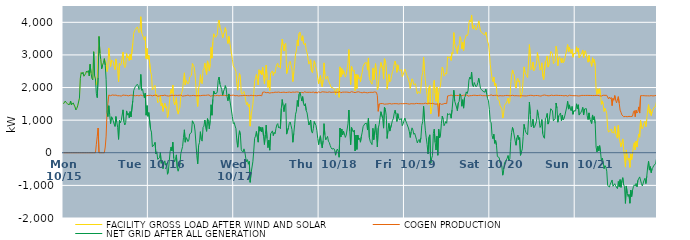
| Category | FACILITY GROSS LOAD AFTER WIND AND SOLAR | COGEN PRODUCTION | NET GRID AFTER ALL GENERATION |
|---|---|---|---|
|  Mon  10/15 | 1501 | 0 | 1501 |
|  Mon  10/15 | 1526 | 0 | 1526 |
|  Mon  10/15 | 1584 | 0 | 1584 |
|  Mon  10/15 | 1548 | 0 | 1548 |
|  Mon  10/15 | 1516 | 0 | 1516 |
|  Mon  10/15 | 1484 | 0 | 1484 |
|  Mon  10/15 | 1492 | 0 | 1492 |
|  Mon  10/15 | 1483 | 0 | 1483 |
|  Mon  10/15 | 1587 | 0 | 1587 |
|  Mon  10/15 | 1468 | 0 | 1468 |
|  Mon  10/15 | 1452 | 0 | 1452 |
|  Mon  10/15 | 1530 | 0 | 1530 |
|  Mon  10/15 | 1464 | 0 | 1464 |
|  Mon  10/15 | 1406 | 0 | 1406 |
|  Mon  10/15 | 1312 | 0 | 1312 |
|  Mon  10/15 | 1363 | 0 | 1363 |
|  Mon  10/15 | 1439 | 0 | 1439 |
|  Mon  10/15 | 1452 | 0 | 1452 |
|  Mon  10/15 | 1676 | 0 | 1676 |
|  Mon  10/15 | 2285 | 0 | 2285 |
|  Mon  10/15 | 2459 | 0 | 2459 |
|  Mon  10/15 | 2412 | 0 | 2412 |
|  Mon  10/15 | 2471 | 0 | 2471 |
|  Mon  10/15 | 2347 | 0 | 2347 |
|  Mon  10/15 | 2388 | 0 | 2388 |
|  Mon  10/15 | 2430 | 0 | 2430 |
|  Mon  10/15 | 2507 | 0 | 2507 |
|  Mon  10/15 | 2468 | 0 | 2468 |
|  Mon  10/15 | 2520 | 0 | 2520 |
|  Mon  10/15 | 2356 | 0 | 2356 |
|  Mon  10/15 | 2713 | 0 | 2713 |
|  Mon  10/15 | 2451 | 0 | 2451 |
|  Mon  10/15 | 2283 | 0 | 2283 |
|  Mon  10/15 | 2235 | 0 | 2235 |
|  Mon  10/15 | 3098 | 0 | 3098 |
|  Mon  10/15 | 2362 | 0 | 2362 |
|  Mon  10/15 | 2264 | 0 | 2264 |
|  Mon  10/15 | 2079 | 261 | 1818 |
|  Mon  10/15 | 2192 | 502 | 1690 |
|  Mon  10/15 | 3062 | 759 | 2303 |
|  Mon  10/15 | 3566 | 0 | 3566 |
|  Mon  10/15 | 3056 | 0 | 3056 |
|  Mon  10/15 | 2862 | 0 | 2862 |
|  Mon  10/15 | 2576 | 0 | 2576 |
|  Mon  10/15 | 2689 | 0 | 2689 |
|  Mon  10/15 | 2764 | 0 | 2764 |
|  Mon  10/15 | 2886 | 0 | 2886 |
|  Mon  10/15 | 2862 | 175 | 2687 |
|  Mon  10/15 | 2758 | 510 | 2248 |
|  Mon  10/15 | 2489 | 1249 | 1240 |
|  Mon  10/15 | 2614 | 1505 | 1109 |
|  Mon  10/15 | 3213 | 1771 | 1442 |
|  Mon  10/15 | 2925 | 1753 | 1172 |
|  Mon  10/15 | 2644 | 1750 | 894 |
|  Mon  10/15 | 2839 | 1736 | 1103 |
|  Mon  10/15 | 2842 | 1773 | 1069 |
|  Mon  10/15 | 2797 | 1750 | 1047 |
|  Mon  10/15 | 2642 | 1763 | 879 |
|  Mon  10/15 | 2551 | 1743 | 808 |
|  Mon  10/15 | 2878 | 1768 | 1110 |
|  Mon  10/15 | 2702 | 1770 | 932 |
|  Mon  10/15 | 2529 | 1748 | 781 |
|  Mon  10/15 | 2179 | 1768 | 411 |
|  Mon  10/15 | 2741 | 1749 | 992 |
|  Mon  10/15 | 2684 | 1764 | 920 |
|  Mon  10/15 | 2727 | 1738 | 989 |
|  Mon  10/15 | 2743 | 1748 | 995 |
|  Mon  10/15 | 3087 | 1771 | 1316 |
|  Mon  10/15 | 2707 | 1753 | 954 |
|  Mon  10/15 | 2612 | 1761 | 851 |
|  Mon  10/15 | 2681 | 1754 | 927 |
|  Mon  10/15 | 3043 | 1760 | 1283 |
|  Mon  10/15 | 2908 | 1753 | 1155 |
|  Mon  10/15 | 2953 | 1745 | 1208 |
|  Mon  10/15 | 2826 | 1752 | 1074 |
|  Mon  10/15 | 3024 | 1762 | 1262 |
|  Mon  10/15 | 2848 | 1748 | 1100 |
|  Mon  10/15 | 2847 | 1766 | 1081 |
|  Mon  10/15 | 3351 | 1752 | 1599 |
|  Mon  10/15 | 3660 | 1754 | 1906 |
|  Mon  10/15 | 3741 | 1760 | 1981 |
|  Mon  10/15 | 3781 | 1749 | 2032 |
|  Mon  10/15 | 3796 | 1762 | 2034 |
|  Mon  10/15 | 3859 | 1758 | 2101 |
|  Mon  10/15 | 3830 | 1771 | 2059 |
|  Mon  10/15 | 3684 | 1745 | 1939 |
|  Mon  10/15 | 3724 | 1754 | 1970 |
|  Mon  10/15 | 4171 | 1769 | 2402 |
|  Mon  10/15 | 3672 | 1757 | 1915 |
|  Mon  10/15 | 3702 | 1749 | 1953 |
|  Mon  10/15 | 3532 | 1739 | 1793 |
|  Mon  10/15 | 3455 | 1767 | 1688 |
|  Mon  10/15 | 3561 | 1735 | 1826 |
|  Mon  10/15 | 2886 | 1734 | 1152 |
|  Mon  10/15 | 3199 | 1753 | 1446 |
|  Mon  10/15 | 2870 | 1752 | 1118 |
|  Tue  10/16 | 2990 | 1759 | 1231 |
|  Tue  10/16 | 2997 | 1758 | 1239 |
|  Tue  10/16 | 2483 | 1762 | 721 |
|  Tue  10/16 | 2394 | 1761 | 633 |
|  Tue  10/16 | 1928 | 1745 | 183 |
|  Tue  10/16 | 1958 | 1764 | 194 |
|  Tue  10/16 | 2013 | 1762 | 251 |
|  Tue  10/16 | 2069 | 1750 | 319 |
|  Tue  10/16 | 1732 | 1766 | -34 |
|  Tue  10/16 | 1791 | 1763 | 28 |
|  Tue  10/16 | 1533 | 1734 | -201 |
|  Tue  10/16 | 1525 | 1755 | -230 |
|  Tue  10/16 | 1589 | 1742 | -153 |
|  Tue  10/16 | 1760 | 1754 | 6 |
|  Tue  10/16 | 1434 | 1755 | -321 |
|  Tue  10/16 | 1520 | 1764 | -244 |
|  Tue  10/16 | 1270 | 1753 | -483 |
|  Tue  10/16 | 1440 | 1763 | -323 |
|  Tue  10/16 | 1521 | 1768 | -247 |
|  Tue  10/16 | 1370 | 1753 | -383 |
|  Tue  10/16 | 1420 | 1749 | -329 |
|  Tue  10/16 | 1082 | 1740 | -658 |
|  Tue  10/16 | 1170 | 1739 | -569 |
|  Tue  10/16 | 1487 | 1744 | -257 |
|  Tue  10/16 | 1787 | 1748 | 39 |
|  Tue  10/16 | 1937 | 1763 | 174 |
|  Tue  10/16 | 1823 | 1764 | 59 |
|  Tue  10/16 | 2074 | 1751 | 323 |
|  Tue  10/16 | 1592 | 1756 | -164 |
|  Tue  10/16 | 1465 | 1744 | -279 |
|  Tue  10/16 | 1560 | 1762 | -202 |
|  Tue  10/16 | 1692 | 1757 | -65 |
|  Tue  10/16 | 1285 | 1758 | -473 |
|  Tue  10/16 | 1185 | 1751 | -566 |
|  Tue  10/16 | 1298 | 1762 | -464 |
|  Tue  10/16 | 1390 | 1765 | -375 |
|  Tue  10/16 | 1746 | 1769 | -23 |
|  Tue  10/16 | 1724 | 1758 | -34 |
|  Tue  10/16 | 1930 | 1736 | 194 |
|  Tue  10/16 | 2234 | 1763 | 471 |
|  Tue  10/16 | 2451 | 1747 | 704 |
|  Tue  10/16 | 2085 | 1761 | 324 |
|  Tue  10/16 | 2215 | 1752 | 463 |
|  Tue  10/16 | 2172 | 1748 | 424 |
|  Tue  10/16 | 2111 | 1768 | 343 |
|  Tue  10/16 | 2155 | 1767 | 388 |
|  Tue  10/16 | 2323 | 1745 | 578 |
|  Tue  10/16 | 2333 | 1758 | 575 |
|  Tue  10/16 | 2374 | 1752 | 622 |
|  Tue  10/16 | 2735 | 1756 | 979 |
|  Tue  10/16 | 2677 | 1760 | 917 |
|  Tue  10/16 | 2628 | 1751 | 877 |
|  Tue  10/16 | 2416 | 1750 | 666 |
|  Tue  10/16 | 2391 | 1755 | 636 |
|  Tue  10/16 | 1658 | 1749 | -91 |
|  Tue  10/16 | 1421 | 1761 | -340 |
|  Tue  10/16 | 1974 | 1750 | 224 |
|  Tue  10/16 | 2083 | 1764 | 319 |
|  Tue  10/16 | 2394 | 1749 | 645 |
|  Tue  10/16 | 2151 | 1749 | 402 |
|  Tue  10/16 | 2116 | 1759 | 357 |
|  Tue  10/16 | 2525 | 1748 | 777 |
|  Tue  10/16 | 2579 | 1762 | 817 |
|  Tue  10/16 | 2747 | 1745 | 1002 |
|  Tue  10/16 | 2776 | 1760 | 1016 |
|  Tue  10/16 | 2401 | 1742 | 659 |
|  Tue  10/16 | 2817 | 1769 | 1048 |
|  Tue  10/16 | 2710 | 1755 | 955 |
|  Tue  10/16 | 2506 | 1772 | 734 |
|  Tue  10/16 | 2724 | 1733 | 991 |
|  Tue  10/16 | 3231 | 1758 | 1473 |
|  Tue  10/16 | 2900 | 1749 | 1151 |
|  Tue  10/16 | 3393 | 1755 | 1638 |
|  Tue  10/16 | 3647 | 1753 | 1894 |
|  Tue  10/16 | 3575 | 1764 | 1811 |
|  Tue  10/16 | 3537 | 1750 | 1787 |
|  Tue  10/16 | 3562 | 1742 | 1820 |
|  Tue  10/16 | 3627 | 1759 | 1868 |
|  Tue  10/16 | 3974 | 1755 | 2219 |
|  Tue  10/16 | 4067 | 1746 | 2321 |
|  Tue  10/16 | 3847 | 1743 | 2104 |
|  Tue  10/16 | 3840 | 1764 | 2076 |
|  Tue  10/16 | 3697 | 1760 | 1937 |
|  Tue  10/16 | 3519 | 1754 | 1765 |
|  Tue  10/16 | 3638 | 1751 | 1887 |
|  Tue  10/16 | 3703 | 1761 | 1942 |
|  Tue  10/16 | 3837 | 1779 | 2058 |
|  Tue  10/16 | 3719 | 1753 | 1966 |
|  Tue  10/16 | 3478 | 1763 | 1715 |
|  Tue  10/16 | 3349 | 1754 | 1595 |
|  Tue  10/16 | 3567 | 1763 | 1804 |
|  Tue  10/16 | 3385 | 1755 | 1630 |
|  Tue  10/16 | 3218 | 1755 | 1463 |
|  Tue  10/16 | 3214 | 1760 | 1454 |
|  Tue  10/16 | 2859 | 1754 | 1105 |
|  Tue  10/16 | 2662 | 1768 | 894 |
|  Wed  10/17 | 2680 | 1755 | 925 |
|  Wed  10/17 | 2567 | 1747 | 820 |
|  Wed  10/17 | 2488 | 1750 | 738 |
|  Wed  10/17 | 2117 | 1755 | 362 |
|  Wed  10/17 | 1920 | 1750 | 170 |
|  Wed  10/17 | 2245 | 1741 | 504 |
|  Wed  10/17 | 2433 | 1758 | 675 |
|  Wed  10/17 | 2295 | 1751 | 544 |
|  Wed  10/17 | 1841 | 1748 | 93 |
|  Wed  10/17 | 1797 | 1751 | 46 |
|  Wed  10/17 | 1788 | 1773 | 15 |
|  Wed  10/17 | 1881 | 1761 | 120 |
|  Wed  10/17 | 1776 | 1752 | 24 |
|  Wed  10/17 | 1594 | 1756 | -162 |
|  Wed  10/17 | 1475 | 1752 | -277 |
|  Wed  10/17 | 1541 | 1752 | -211 |
|  Wed  10/17 | 1411 | 1761 | -350 |
|  Wed  10/17 | 1485 | 1749 | -264 |
|  Wed  10/17 | 816 | 1722 | -906 |
|  Wed  10/17 | 1141 | 1764 | -623 |
|  Wed  10/17 | 1131 | 1757 | -626 |
|  Wed  10/17 | 1475 | 1752 | -277 |
|  Wed  10/17 | 1813 | 1759 | 54 |
|  Wed  10/17 | 2199 | 1754 | 445 |
|  Wed  10/17 | 2275 | 1766 | 509 |
|  Wed  10/17 | 2401 | 1748 | 653 |
|  Wed  10/17 | 2256 | 1769 | 487 |
|  Wed  10/17 | 2078 | 1754 | 324 |
|  Wed  10/17 | 2545 | 1744 | 801 |
|  Wed  10/17 | 2424 | 1761 | 663 |
|  Wed  10/17 | 2516 | 1734 | 782 |
|  Wed  10/17 | 2388 | 1747 | 641 |
|  Wed  10/17 | 2627 | 1855 | 772 |
|  Wed  10/17 | 2360 | 1851 | 509 |
|  Wed  10/17 | 2117 | 1863 | 254 |
|  Wed  10/17 | 2420 | 1867 | 553 |
|  Wed  10/17 | 2691 | 1843 | 848 |
|  Wed  10/17 | 2295 | 1860 | 435 |
|  Wed  10/17 | 2003 | 1847 | 156 |
|  Wed  10/17 | 2223 | 1836 | 387 |
|  Wed  10/17 | 1911 | 1831 | 80 |
|  Wed  10/17 | 2438 | 1857 | 581 |
|  Wed  10/17 | 2444 | 1843 | 601 |
|  Wed  10/17 | 2511 | 1840 | 671 |
|  Wed  10/17 | 2370 | 1843 | 527 |
|  Wed  10/17 | 2475 | 1852 | 623 |
|  Wed  10/17 | 2441 | 1858 | 583 |
|  Wed  10/17 | 2614 | 1866 | 748 |
|  Wed  10/17 | 2709 | 1853 | 856 |
|  Wed  10/17 | 2741 | 1847 | 894 |
|  Wed  10/17 | 2626 | 1861 | 765 |
|  Wed  10/17 | 2663 | 1867 | 796 |
|  Wed  10/17 | 2589 | 1848 | 741 |
|  Wed  10/17 | 3205 | 1845 | 1360 |
|  Wed  10/17 | 3484 | 1852 | 1632 |
|  Wed  10/17 | 3306 | 1861 | 1445 |
|  Wed  10/17 | 3119 | 1858 | 1261 |
|  Wed  10/17 | 3325 | 1864 | 1461 |
|  Wed  10/17 | 3357 | 1847 | 1510 |
|  Wed  10/17 | 2425 | 1853 | 572 |
|  Wed  10/17 | 2431 | 1853 | 578 |
|  Wed  10/17 | 2623 | 1852 | 771 |
|  Wed  10/17 | 2763 | 1861 | 902 |
|  Wed  10/17 | 2805 | 1861 | 944 |
|  Wed  10/17 | 2676 | 1848 | 828 |
|  Wed  10/17 | 2566 | 1859 | 707 |
|  Wed  10/17 | 2184 | 1861 | 323 |
|  Wed  10/17 | 2467 | 1873 | 594 |
|  Wed  10/17 | 2711 | 1855 | 856 |
|  Wed  10/17 | 3034 | 1852 | 1182 |
|  Wed  10/17 | 3141 | 1865 | 1276 |
|  Wed  10/17 | 3460 | 1857 | 1603 |
|  Wed  10/17 | 3282 | 1861 | 1421 |
|  Wed  10/17 | 3655 | 1858 | 1797 |
|  Wed  10/17 | 3700 | 1840 | 1860 |
|  Wed  10/17 | 3585 | 1850 | 1735 |
|  Wed  10/17 | 3438 | 1852 | 1586 |
|  Wed  10/17 | 3586 | 1865 | 1721 |
|  Wed  10/17 | 3343 | 1837 | 1506 |
|  Wed  10/17 | 3308 | 1873 | 1435 |
|  Wed  10/17 | 3367 | 1862 | 1505 |
|  Wed  10/17 | 3150 | 1853 | 1297 |
|  Wed  10/17 | 3068 | 1846 | 1222 |
|  Wed  10/17 | 3072 | 1854 | 1218 |
|  Wed  10/17 | 2717 | 1866 | 851 |
|  Wed  10/17 | 2777 | 1855 | 922 |
|  Wed  10/17 | 2853 | 1854 | 999 |
|  Wed  10/17 | 2507 | 1850 | 657 |
|  Wed  10/17 | 2454 | 1851 | 603 |
|  Wed  10/17 | 2600 | 1862 | 738 |
|  Wed  10/17 | 2819 | 1860 | 959 |
|  Wed  10/17 | 2715 | 1833 | 882 |
|  Wed  10/17 | 2708 | 1869 | 839 |
|  Wed  10/17 | 2504 | 1827 | 677 |
|  Wed  10/17 | 2287 | 1848 | 439 |
|  Wed  10/17 | 2117 | 1867 | 250 |
|  Thu  10/18 | 2286 | 1850 | 436 |
|  Thu  10/18 | 2367 | 1846 | 521 |
|  Thu  10/18 | 2117 | 1850 | 267 |
|  Thu  10/18 | 2019 | 1870 | 149 |
|  Thu  10/18 | 2233 | 1863 | 370 |
|  Thu  10/18 | 2756 | 1864 | 892 |
|  Thu  10/18 | 2407 | 1855 | 552 |
|  Thu  10/18 | 2252 | 1859 | 393 |
|  Thu  10/18 | 2312 | 1865 | 447 |
|  Thu  10/18 | 2354 | 1852 | 502 |
|  Thu  10/18 | 2207 | 1853 | 354 |
|  Thu  10/18 | 2179 | 1867 | 312 |
|  Thu  10/18 | 2084 | 1862 | 222 |
|  Thu  10/18 | 2006 | 1851 | 155 |
|  Thu  10/18 | 1985 | 1871 | 114 |
|  Thu  10/18 | 1992 | 1857 | 135 |
|  Thu  10/18 | 1997 | 1867 | 130 |
|  Thu  10/18 | 1943 | 1858 | 85 |
|  Thu  10/18 | 1773 | 1847 | -74 |
|  Thu  10/18 | 1912 | 1854 | 58 |
|  Thu  10/18 | 1976 | 1863 | 113 |
|  Thu  10/18 | 1908 | 1856 | 52 |
|  Thu  10/18 | 1698 | 1835 | -137 |
|  Thu  10/18 | 2634 | 1875 | 759 |
|  Thu  10/18 | 2323 | 1840 | 483 |
|  Thu  10/18 | 2584 | 1857 | 727 |
|  Thu  10/18 | 2406 | 1859 | 547 |
|  Thu  10/18 | 2517 | 1855 | 662 |
|  Thu  10/18 | 2433 | 1859 | 574 |
|  Thu  10/18 | 2320 | 1849 | 471 |
|  Thu  10/18 | 2398 | 1860 | 538 |
|  Thu  10/18 | 2388 | 1855 | 533 |
|  Thu  10/18 | 2743 | 1856 | 887 |
|  Thu  10/18 | 3164 | 1853 | 1311 |
|  Thu  10/18 | 2501 | 1846 | 655 |
|  Thu  10/18 | 2091 | 1847 | 244 |
|  Thu  10/18 | 2649 | 1873 | 776 |
|  Thu  10/18 | 2547 | 1860 | 687 |
|  Thu  10/18 | 2494 | 1857 | 637 |
|  Thu  10/18 | 2535 | 1841 | 694 |
|  Thu  10/18 | 1902 | 1845 | 57 |
|  Thu  10/18 | 2411 | 1867 | 544 |
|  Thu  10/18 | 1966 | 1863 | 103 |
|  Thu  10/18 | 2391 | 1847 | 544 |
|  Thu  10/18 | 2274 | 1869 | 405 |
|  Thu  10/18 | 2306 | 1865 | 441 |
|  Thu  10/18 | 2174 | 1850 | 324 |
|  Thu  10/18 | 2356 | 1855 | 501 |
|  Thu  10/18 | 2471 | 1839 | 632 |
|  Thu  10/18 | 2648 | 1845 | 803 |
|  Thu  10/18 | 2636 | 1859 | 777 |
|  Thu  10/18 | 2755 | 1861 | 894 |
|  Thu  10/18 | 2747 | 1845 | 902 |
|  Thu  10/18 | 2762 | 1856 | 906 |
|  Thu  10/18 | 2535 | 1838 | 697 |
|  Thu  10/18 | 2907 | 1841 | 1066 |
|  Thu  10/18 | 2313 | 1850 | 463 |
|  Thu  10/18 | 2202 | 1853 | 349 |
|  Thu  10/18 | 2189 | 1854 | 335 |
|  Thu  10/18 | 2102 | 1852 | 250 |
|  Thu  10/18 | 2600 | 1851 | 749 |
|  Thu  10/18 | 2243 | 1841 | 402 |
|  Thu  10/18 | 2526 | 1866 | 660 |
|  Thu  10/18 | 2733 | 1852 | 881 |
|  Thu  10/18 | 2393 | 1852 | 541 |
|  Thu  10/18 | 1933 | 1755 | 178 |
|  Thu  10/18 | 2027 | 1271 | 756 |
|  Thu  10/18 | 2357 | 1496 | 861 |
|  Thu  10/18 | 2587 | 1516 | 1071 |
|  Thu  10/18 | 2768 | 1509 | 1259 |
|  Thu  10/18 | 2762 | 1511 | 1251 |
|  Thu  10/18 | 2565 | 1509 | 1056 |
|  Thu  10/18 | 2259 | 1504 | 755 |
|  Thu  10/18 | 2885 | 1490 | 1395 |
|  Thu  10/18 | 2835 | 1504 | 1331 |
|  Thu  10/18 | 2643 | 1495 | 1148 |
|  Thu  10/18 | 1946 | 1508 | 438 |
|  Thu  10/18 | 2183 | 1497 | 686 |
|  Thu  10/18 | 2405 | 1502 | 903 |
|  Thu  10/18 | 2175 | 1510 | 665 |
|  Thu  10/18 | 2206 | 1511 | 695 |
|  Thu  10/18 | 2370 | 1495 | 875 |
|  Thu  10/18 | 2491 | 1497 | 994 |
|  Thu  10/18 | 2552 | 1504 | 1048 |
|  Thu  10/18 | 2713 | 1501 | 1212 |
|  Thu  10/18 | 2810 | 1506 | 1304 |
|  Thu  10/18 | 2689 | 1507 | 1182 |
|  Thu  10/18 | 2464 | 1505 | 959 |
|  Thu  10/18 | 2695 | 1497 | 1198 |
|  Thu  10/18 | 2561 | 1496 | 1065 |
|  Thu  10/18 | 2514 | 1506 | 1008 |
|  Thu  10/18 | 2488 | 1506 | 982 |
|  Thu  10/18 | 2550 | 1500 | 1050 |
|  Thu  10/18 | 2332 | 1503 | 829 |
|  Thu  10/18 | 2385 | 1499 | 886 |
|  Thu  10/18 | 2488 | 1505 | 983 |
|  Fri  10/19 | 2565 | 1499 | 1066 |
|  Fri  10/19 | 2483 | 1511 | 972 |
|  Fri  10/19 | 2394 | 1493 | 901 |
|  Fri  10/19 | 2384 | 1502 | 882 |
|  Fri  10/19 | 2257 | 1498 | 759 |
|  Fri  10/19 | 2137 | 1492 | 645 |
|  Fri  10/19 | 1972 | 1502 | 470 |
|  Fri  10/19 | 2150 | 1505 | 645 |
|  Fri  10/19 | 2269 | 1505 | 764 |
|  Fri  10/19 | 2200 | 1502 | 698 |
|  Fri  10/19 | 2087 | 1520 | 567 |
|  Fri  10/19 | 2099 | 1501 | 598 |
|  Fri  10/19 | 2117 | 1492 | 625 |
|  Fri  10/19 | 1927 | 1514 | 413 |
|  Fri  10/19 | 1803 | 1502 | 301 |
|  Fri  10/19 | 1879 | 1507 | 372 |
|  Fri  10/19 | 1908 | 1498 | 410 |
|  Fri  10/19 | 1819 | 1505 | 314 |
|  Fri  10/19 | 1987 | 1523 | 464 |
|  Fri  10/19 | 2344 | 1503 | 841 |
|  Fri  10/19 | 2451 | 1501 | 950 |
|  Fri  10/19 | 2929 | 1505 | 1424 |
|  Fri  10/19 | 2496 | 1484 | 1012 |
|  Fri  10/19 | 2211 | 1521 | 690 |
|  Fri  10/19 | 1967 | 1509 | 458 |
|  Fri  10/19 | 1751 | 1500 | 251 |
|  Fri  10/19 | 1479 | 1515 | -36 |
|  Fri  10/19 | 1996 | 1522 | 474 |
|  Fri  10/19 | 2060 | 1509 | 551 |
|  Fri  10/19 | 1192 | 1509 | -317 |
|  Fri  10/19 | 1328 | 1504 | -176 |
|  Fri  10/19 | 1425 | 1514 | -89 |
|  Fri  10/19 | 2090 | 1498 | 592 |
|  Fri  10/19 | 2221 | 1498 | 723 |
|  Fri  10/19 | 1815 | 1501 | 314 |
|  Fri  10/19 | 1574 | 1490 | 84 |
|  Fri  10/19 | 2016 | 1508 | 508 |
|  Fri  10/19 | 1426 | 1502 | -76 |
|  Fri  10/19 | 1836 | 1116 | 720 |
|  Fri  10/19 | 1971 | 1515 | 456 |
|  Fri  10/19 | 2050 | 1507 | 543 |
|  Fri  10/19 | 2372 | 1485 | 887 |
|  Fri  10/19 | 2628 | 1503 | 1125 |
|  Fri  10/19 | 2526 | 1495 | 1031 |
|  Fri  10/19 | 2349 | 1520 | 829 |
|  Fri  10/19 | 2399 | 1514 | 885 |
|  Fri  10/19 | 2450 | 1492 | 958 |
|  Fri  10/19 | 2412 | 1508 | 904 |
|  Fri  10/19 | 2947 | 1742 | 1205 |
|  Fri  10/19 | 2934 | 1760 | 1174 |
|  Fri  10/19 | 2903 | 1753 | 1150 |
|  Fri  10/19 | 2952 | 1756 | 1196 |
|  Fri  10/19 | 2830 | 1770 | 1060 |
|  Fri  10/19 | 3074 | 1760 | 1314 |
|  Fri  10/19 | 3033 | 1746 | 1287 |
|  Fri  10/19 | 3684 | 1768 | 1916 |
|  Fri  10/19 | 3342 | 1758 | 1584 |
|  Fri  10/19 | 3323 | 1756 | 1567 |
|  Fri  10/19 | 3158 | 1756 | 1402 |
|  Fri  10/19 | 3044 | 1754 | 1290 |
|  Fri  10/19 | 3280 | 1756 | 1524 |
|  Fri  10/19 | 3317 | 1741 | 1576 |
|  Fri  10/19 | 3559 | 1753 | 1806 |
|  Fri  10/19 | 3473 | 1736 | 1737 |
|  Fri  10/19 | 3180 | 1753 | 1427 |
|  Fri  10/19 | 3383 | 1757 | 1626 |
|  Fri  10/19 | 3131 | 1763 | 1368 |
|  Fri  10/19 | 3457 | 1770 | 1687 |
|  Fri  10/19 | 3510 | 1768 | 1742 |
|  Fri  10/19 | 3616 | 1749 | 1867 |
|  Fri  10/19 | 3584 | 1770 | 1814 |
|  Fri  10/19 | 3645 | 1737 | 1908 |
|  Fri  10/19 | 3980 | 1752 | 2228 |
|  Fri  10/19 | 4069 | 1749 | 2320 |
|  Fri  10/19 | 4006 | 1748 | 2258 |
|  Fri  10/19 | 4225 | 1753 | 2472 |
|  Fri  10/19 | 3831 | 1756 | 2075 |
|  Fri  10/19 | 3788 | 1762 | 2026 |
|  Fri  10/19 | 3915 | 1761 | 2154 |
|  Fri  10/19 | 3848 | 1763 | 2085 |
|  Fri  10/19 | 3762 | 1740 | 2022 |
|  Fri  10/19 | 3813 | 1753 | 2060 |
|  Fri  10/19 | 3904 | 1756 | 2148 |
|  Fri  10/19 | 4042 | 1758 | 2284 |
|  Fri  10/19 | 3886 | 1751 | 2135 |
|  Fri  10/19 | 3737 | 1765 | 1972 |
|  Fri  10/19 | 3695 | 1758 | 1937 |
|  Fri  10/19 | 3719 | 1752 | 1967 |
|  Fri  10/19 | 3650 | 1767 | 1883 |
|  Fri  10/19 | 3649 | 1751 | 1898 |
|  Fri  10/19 | 3608 | 1751 | 1857 |
|  Fri  10/19 | 3700 | 1751 | 1949 |
|  Fri  10/19 | 3567 | 1764 | 1803 |
|  Fri  10/19 | 3406 | 1748 | 1658 |
|  Fri  10/19 | 3334 | 1741 | 1593 |
|  Fri  10/19 | 3077 | 1755 | 1322 |
|  Sat  10/20 | 2709 | 1757 | 952 |
|  Sat  10/20 | 2696 | 1776 | 920 |
|  Sat  10/20 | 2277 | 1748 | 529 |
|  Sat  10/20 | 2183 | 1752 | 431 |
|  Sat  10/20 | 2323 | 1757 | 566 |
|  Sat  10/20 | 2050 | 1760 | 290 |
|  Sat  10/20 | 2137 | 1761 | 376 |
|  Sat  10/20 | 1991 | 1763 | 228 |
|  Sat  10/20 | 1646 | 1761 | -115 |
|  Sat  10/20 | 1650 | 1740 | -90 |
|  Sat  10/20 | 1607 | 1754 | -147 |
|  Sat  10/20 | 1451 | 1752 | -301 |
|  Sat  10/20 | 1434 | 1756 | -322 |
|  Sat  10/20 | 1348 | 1747 | -399 |
|  Sat  10/20 | 1065 | 1752 | -687 |
|  Sat  10/20 | 1205 | 1747 | -542 |
|  Sat  10/20 | 1457 | 1767 | -310 |
|  Sat  10/20 | 1469 | 1756 | -287 |
|  Sat  10/20 | 1525 | 1744 | -219 |
|  Sat  10/20 | 1591 | 1759 | -168 |
|  Sat  10/20 | 1675 | 1761 | -86 |
|  Sat  10/20 | 1513 | 1750 | -237 |
|  Sat  10/20 | 1579 | 1762 | -183 |
|  Sat  10/20 | 2094 | 1749 | 345 |
|  Sat  10/20 | 2380 | 1760 | 620 |
|  Sat  10/20 | 2539 | 1763 | 776 |
|  Sat  10/20 | 2429 | 1756 | 673 |
|  Sat  10/20 | 2392 | 1748 | 644 |
|  Sat  10/20 | 2115 | 1750 | 365 |
|  Sat  10/20 | 1983 | 1752 | 231 |
|  Sat  10/20 | 2208 | 1752 | 456 |
|  Sat  10/20 | 2285 | 1747 | 538 |
|  Sat  10/20 | 2169 | 1765 | 404 |
|  Sat  10/20 | 2212 | 1745 | 467 |
|  Sat  10/20 | 1681 | 1759 | -78 |
|  Sat  10/20 | 1770 | 1750 | 20 |
|  Sat  10/20 | 1866 | 1748 | 118 |
|  Sat  10/20 | 2248 | 1747 | 501 |
|  Sat  10/20 | 2633 | 1761 | 872 |
|  Sat  10/20 | 2471 | 1743 | 728 |
|  Sat  10/20 | 2397 | 1769 | 628 |
|  Sat  10/20 | 2359 | 1744 | 615 |
|  Sat  10/20 | 2306 | 1754 | 552 |
|  Sat  10/20 | 2781 | 1754 | 1027 |
|  Sat  10/20 | 3315 | 1761 | 1554 |
|  Sat  10/20 | 2942 | 1761 | 1181 |
|  Sat  10/20 | 2547 | 1752 | 795 |
|  Sat  10/20 | 2588 | 1760 | 828 |
|  Sat  10/20 | 2782 | 1753 | 1029 |
|  Sat  10/20 | 2514 | 1746 | 768 |
|  Sat  10/20 | 2560 | 1757 | 803 |
|  Sat  10/20 | 2573 | 1756 | 817 |
|  Sat  10/20 | 2727 | 1766 | 961 |
|  Sat  10/20 | 3071 | 1756 | 1315 |
|  Sat  10/20 | 2899 | 1761 | 1138 |
|  Sat  10/20 | 2748 | 1746 | 1002 |
|  Sat  10/20 | 2532 | 1756 | 776 |
|  Sat  10/20 | 2577 | 1738 | 839 |
|  Sat  10/20 | 2758 | 1739 | 1019 |
|  Sat  10/20 | 2348 | 1762 | 586 |
|  Sat  10/20 | 2238 | 1755 | 483 |
|  Sat  10/20 | 2213 | 1770 | 443 |
|  Sat  10/20 | 2797 | 1752 | 1045 |
|  Sat  10/20 | 2845 | 1759 | 1086 |
|  Sat  10/20 | 2968 | 1763 | 1205 |
|  Sat  10/20 | 2626 | 1747 | 879 |
|  Sat  10/20 | 2699 | 1745 | 954 |
|  Sat  10/20 | 2724 | 1752 | 972 |
|  Sat  10/20 | 3107 | 1755 | 1352 |
|  Sat  10/20 | 3111 | 1766 | 1345 |
|  Sat  10/20 | 3037 | 1754 | 1283 |
|  Sat  10/20 | 2734 | 1754 | 980 |
|  Sat  10/20 | 2751 | 1739 | 1012 |
|  Sat  10/20 | 2810 | 1760 | 1050 |
|  Sat  10/20 | 3265 | 1739 | 1526 |
|  Sat  10/20 | 3129 | 1763 | 1366 |
|  Sat  10/20 | 2670 | 1733 | 937 |
|  Sat  10/20 | 2889 | 1756 | 1133 |
|  Sat  10/20 | 2947 | 1772 | 1175 |
|  Sat  10/20 | 2977 | 1757 | 1220 |
|  Sat  10/20 | 2758 | 1774 | 984 |
|  Sat  10/20 | 2906 | 1755 | 1151 |
|  Sat  10/20 | 2759 | 1750 | 1009 |
|  Sat  10/20 | 2793 | 1745 | 1048 |
|  Sat  10/20 | 2906 | 1750 | 1156 |
|  Sat  10/20 | 2925 | 1757 | 1168 |
|  Sat  10/20 | 3163 | 1760 | 1403 |
|  Sat  10/20 | 3316 | 1737 | 1579 |
|  Sat  10/20 | 3100 | 1761 | 1339 |
|  Sat  10/20 | 3231 | 1763 | 1468 |
|  Sat  10/20 | 3096 | 1757 | 1339 |
|  Sat  10/20 | 3043 | 1757 | 1286 |
|  Sat  10/20 | 3171 | 1750 | 1421 |
|  Sat  10/20 | 2930 | 1750 | 1180 |
|  Sat  10/20 | 3047 | 1761 | 1286 |
|  Sat  10/20 | 3034 | 1751 | 1283 |
|  Sun  10/21 | 3038 | 1754 | 1284 |
|  Sun  10/21 | 3251 | 1750 | 1501 |
|  Sun  10/21 | 3104 | 1756 | 1348 |
|  Sun  10/21 | 3212 | 1741 | 1471 |
|  Sun  10/21 | 2912 | 1756 | 1156 |
|  Sun  10/21 | 2888 | 1746 | 1142 |
|  Sun  10/21 | 3012 | 1771 | 1241 |
|  Sun  10/21 | 3068 | 1760 | 1308 |
|  Sun  10/21 | 3152 | 1761 | 1391 |
|  Sun  10/21 | 2920 | 1757 | 1163 |
|  Sun  10/21 | 3096 | 1755 | 1341 |
|  Sun  10/21 | 3127 | 1758 | 1369 |
|  Sun  10/21 | 3113 | 1759 | 1354 |
|  Sun  10/21 | 2893 | 1759 | 1134 |
|  Sun  10/21 | 2776 | 1757 | 1019 |
|  Sun  10/21 | 2980 | 1757 | 1223 |
|  Sun  10/21 | 2804 | 1772 | 1032 |
|  Sun  10/21 | 2761 | 1757 | 1004 |
|  Sun  10/21 | 2649 | 1753 | 896 |
|  Sun  10/21 | 2913 | 1754 | 1159 |
|  Sun  10/21 | 2771 | 1753 | 1018 |
|  Sun  10/21 | 2859 | 1754 | 1105 |
|  Sun  10/21 | 2666 | 1769 | 897 |
|  Sun  10/21 | 1934 | 1759 | 175 |
|  Sun  10/21 | 1785 | 1760 | 25 |
|  Sun  10/21 | 1960 | 1759 | 201 |
|  Sun  10/21 | 1817 | 1760 | 57 |
|  Sun  10/21 | 1965 | 1747 | 218 |
|  Sun  10/21 | 1767 | 1748 | 19 |
|  Sun  10/21 | 1484 | 1740 | -256 |
|  Sun  10/21 | 1590 | 1757 | -167 |
|  Sun  10/21 | 1486 | 1763 | -277 |
|  Sun  10/21 | 1268 | 1754 | -486 |
|  Sun  10/21 | 1364 | 1761 | -397 |
|  Sun  10/21 | 1303 | 1747 | -444 |
|  Sun  10/21 | 1198 | 1761 | -563 |
|  Sun  10/21 | 746 | 1748 | -1002 |
|  Sun  10/21 | 631 | 1653 | -1022 |
|  Sun  10/21 | 655 | 1705 | -1050 |
|  Sun  10/21 | 695 | 1658 | -963 |
|  Sun  10/21 | 729 | 1694 | -965 |
|  Sun  10/21 | 611 | 1445 | -834 |
|  Sun  10/21 | 643 | 1670 | -1027 |
|  Sun  10/21 | 599 | 1610 | -1011 |
|  Sun  10/21 | 806 | 1755 | -949 |
|  Sun  10/21 | 604 | 1619 | -1015 |
|  Sun  10/21 | 506 | 1531 | -1025 |
|  Sun  10/21 | 447 | 1548 | -1101 |
|  Sun  10/21 | 840 | 1720 | -880 |
|  Sun  10/21 | 473 | 1516 | -1043 |
|  Sun  10/21 | 485 | 1308 | -823 |
|  Sun  10/21 | 180 | 1240 | -1060 |
|  Sun  10/21 | 309 | 1160 | -851 |
|  Sun  10/21 | 426 | 1190 | -764 |
|  Sun  10/21 | 122 | 1107 | -985 |
|  Sun  10/21 | 101 | 1131 | -1030 |
|  Sun  10/21 | -439 | 1113 | -1552 |
|  Sun  10/21 | 87 | 1105 | -1018 |
|  Sun  10/21 | -133 | 1106 | -1239 |
|  Sun  10/21 | -227 | 1115 | -1342 |
|  Sun  10/21 | -160 | 1116 | -1276 |
|  Sun  10/21 | -447 | 1100 | -1547 |
|  Sun  10/21 | -32 | 1110 | -1142 |
|  Sun  10/21 | -213 | 1130 | -1343 |
|  Sun  10/21 | -29 | 1122 | -1151 |
|  Sun  10/21 | 212 | 1247 | -1035 |
|  Sun  10/21 | 308 | 1291 | -983 |
|  Sun  10/21 | 89 | 1105 | -1016 |
|  Sun  10/21 | 361 | 1302 | -941 |
|  Sun  10/21 | 175 | 1222 | -1047 |
|  Sun  10/21 | 416 | 1261 | -845 |
|  Sun  10/21 | 577 | 1406 | -829 |
|  Sun  10/21 | 477 | 1217 | -740 |
|  Sun  10/21 | 990 | 1747 | -757 |
|  Sun  10/21 | 813 | 1755 | -942 |
|  Sun  10/21 | 735 | 1752 | -1017 |
|  Sun  10/21 | 731 | 1742 | -1011 |
|  Sun  10/21 | 910 | 1750 | -840 |
|  Sun  10/21 | 970 | 1751 | -781 |
|  Sun  10/21 | 801 | 1746 | -945 |
|  Sun  10/21 | 1030 | 1752 | -722 |
|  Sun  10/21 | 1309 | 1746 | -437 |
|  Sun  10/21 | 1474 | 1737 | -263 |
|  Sun  10/21 | 1212 | 1743 | -531 |
|  Sun  10/21 | 1333 | 1757 | -424 |
|  Sun  10/21 | 1144 | 1753 | -609 |
|  Sun  10/21 | 1268 | 1752 | -484 |
|  Sun  10/21 | 1298 | 1742 | -444 |
|  Sun  10/21 | 1384 | 1769 | -385 |
|  Sun  10/21 | 1392 | 1750 | -358 |
|  Sun  10/21 | 1422 | 1758 | -336 |
|  Sun  10/21 | 1589 | 1763 | -174 |